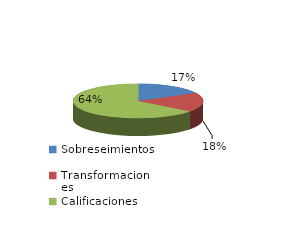
| Category | Series 0 |
|---|---|
| Sobreseimientos | 456 |
| Transformaciones | 481 |
| Calificaciones | 1700 |